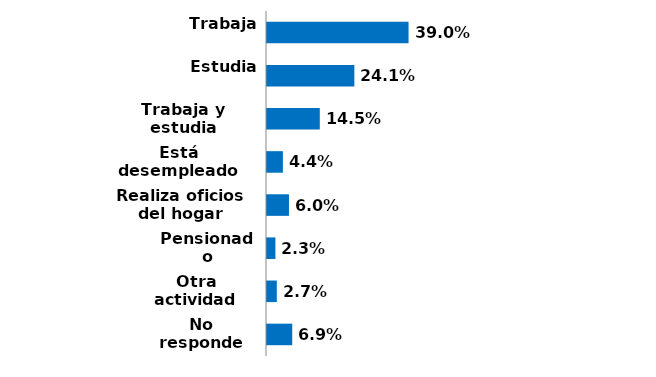
| Category | Series 0 |
|---|---|
| Trabaja | 0.39 |
| Estudia | 0.241 |
| Trabaja y estudia | 0.145 |
| Está desempleado | 0.044 |
| Realiza oficios del hogar | 0.06 |
| Pensionado | 0.023 |
| Otra actividad | 0.027 |
| No responde | 0.069 |